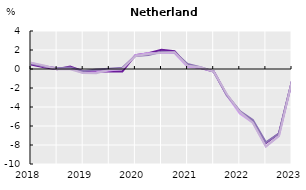
| Category | Basic wage (all sectors) | Basic wage (private sector) | Wage incl. Lump sums and special payments (all sectors) | Wage incl. Lump sums and special payments (private sector) |
|---|---|---|---|---|
| 2018.0 | 0.466 | 0.664 | 0.565 | 0.664 |
| nan | 0.179 | 0.278 | 0.278 | 0.376 |
| nan | -0.029 | 0.069 | 0.069 | -0.029 |
| nan | 0.263 | 0.067 | 0.165 | -0.031 |
| 2019.0 | -0.235 | -0.43 | -0.235 | -0.43 |
| nan | -0.251 | -0.349 | -0.056 | -0.446 |
| nan | -0.261 | -0.163 | 0.031 | -0.066 |
| nan | -0.26 | 0.032 | 0.13 | 0.032 |
| 2020.0 | 1.464 | 1.464 | 1.365 | 1.365 |
| nan | 1.666 | 1.666 | 1.469 | 1.568 |
| nan | 2.015 | 1.718 | 1.817 | 1.718 |
| nan | 1.871 | 1.673 | 1.772 | 1.772 |
| 2021.0 | 0.341 | 0.243 | 0.538 | 0.341 |
| nan | 0.092 | 0.092 | 0.19 | 0.19 |
| nan | -0.26 | -0.26 | -0.26 | -0.26 |
| nan | -2.733 | -2.733 | -2.733 | -2.638 |
| 2022.0 | -4.509 | -4.695 | -4.416 | -4.509 |
| nan | -5.558 | -5.65 | -5.375 | -5.65 |
| nan | -7.806 | -8.162 | -7.717 | -8.162 |
| nan | -6.787 | -7.057 | -6.787 | -7.057 |
| 2023.0 | -1.238 | -1.332 | -1.238 | -1.238 |